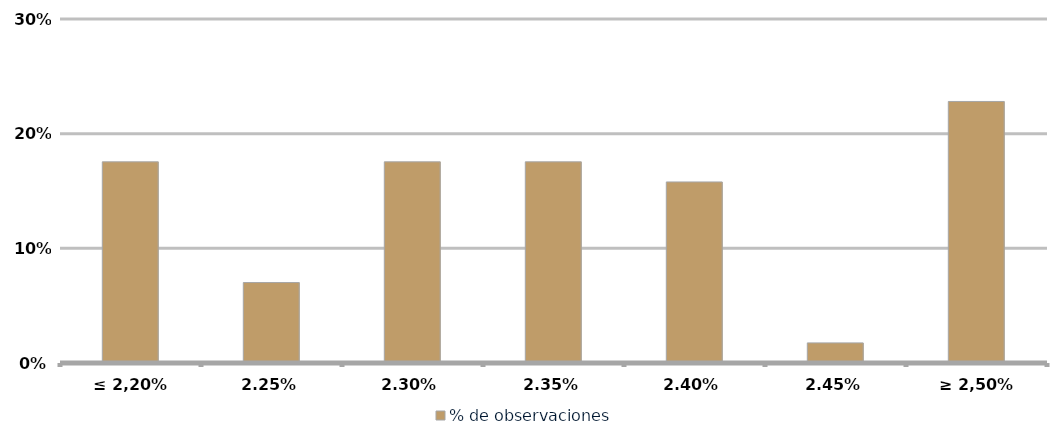
| Category | % de observaciones  |
|---|---|
| ≤ 2,20% | 0.175 |
| 2,25% | 0.07 |
| 2,30% | 0.175 |
| 2,35% | 0.175 |
| 2,40% | 0.158 |
| 2,45% | 0.018 |
| ≥ 2,50% | 0.228 |